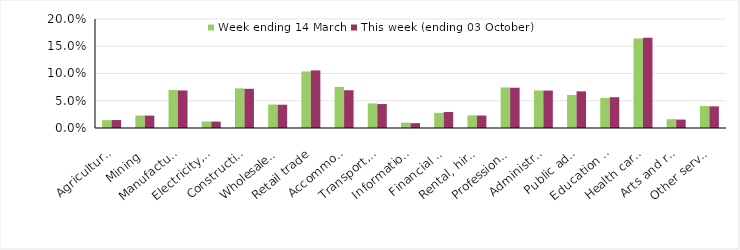
| Category | Week ending 14 March | This week (ending 03 October) |
|---|---|---|
| Agriculture, forestry and fishing | 0.014 | 0.015 |
| Mining | 0.023 | 0.023 |
| Manufacturing | 0.07 | 0.069 |
| Electricity, gas, water and waste services | 0.012 | 0.012 |
| Construction | 0.073 | 0.072 |
| Wholesale trade | 0.043 | 0.043 |
| Retail trade | 0.104 | 0.106 |
| Accommodation and food services | 0.075 | 0.069 |
| Transport, postal and warehousing | 0.045 | 0.044 |
| Information media and telecommunications | 0.01 | 0.009 |
| Financial and insurance services | 0.028 | 0.029 |
| Rental, hiring and real estate services | 0.023 | 0.023 |
| Professional, scientific and technical services | 0.074 | 0.074 |
| Administrative and support services | 0.069 | 0.069 |
| Public administration and safety | 0.061 | 0.067 |
| Education and training | 0.055 | 0.056 |
| Health care and social assistance | 0.164 | 0.165 |
| Arts and recreation services | 0.016 | 0.016 |
| Other services | 0.04 | 0.04 |